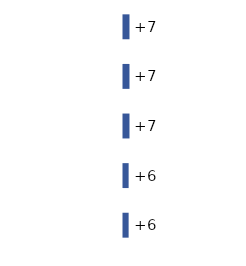
| Category | Series 0 |
|---|---|
| 0 | 7 |
| 1 | 7 |
| 2 | 7 |
| 3 | 6 |
| 4 | 6 |